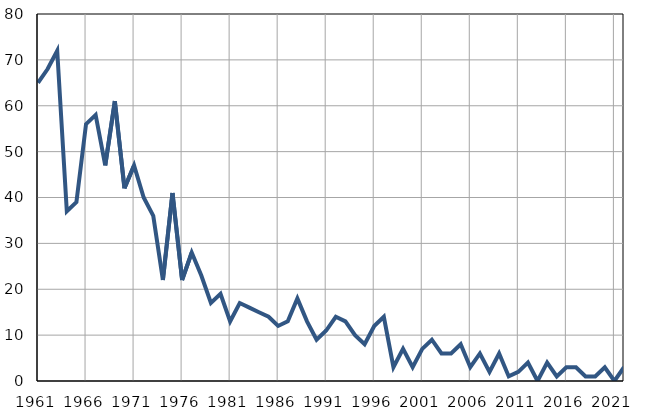
| Category | Infants
deaths |
|---|---|
| 1961.0 | 65 |
| 1962.0 | 68 |
| 1963.0 | 72 |
| 1964.0 | 37 |
| 1965.0 | 39 |
| 1966.0 | 56 |
| 1967.0 | 58 |
| 1968.0 | 47 |
| 1969.0 | 61 |
| 1970.0 | 42 |
| 1971.0 | 47 |
| 1972.0 | 40 |
| 1973.0 | 36 |
| 1974.0 | 22 |
| 1975.0 | 41 |
| 1976.0 | 22 |
| 1977.0 | 28 |
| 1978.0 | 23 |
| 1979.0 | 17 |
| 1980.0 | 19 |
| 1981.0 | 13 |
| 1982.0 | 17 |
| 1983.0 | 16 |
| 1984.0 | 15 |
| 1985.0 | 14 |
| 1986.0 | 12 |
| 1987.0 | 13 |
| 1988.0 | 18 |
| 1989.0 | 13 |
| 1990.0 | 9 |
| 1991.0 | 11 |
| 1992.0 | 14 |
| 1993.0 | 13 |
| 1994.0 | 10 |
| 1995.0 | 8 |
| 1996.0 | 12 |
| 1997.0 | 14 |
| 1998.0 | 3 |
| 1999.0 | 7 |
| 2000.0 | 3 |
| 2001.0 | 7 |
| 2002.0 | 9 |
| 2003.0 | 6 |
| 2004.0 | 6 |
| 2005.0 | 8 |
| 2006.0 | 3 |
| 2007.0 | 6 |
| 2008.0 | 2 |
| 2009.0 | 6 |
| 2010.0 | 1 |
| 2011.0 | 2 |
| 2012.0 | 4 |
| 2013.0 | 0 |
| 2014.0 | 4 |
| 2015.0 | 1 |
| 2016.0 | 3 |
| 2017.0 | 3 |
| 2018.0 | 1 |
| 2019.0 | 1 |
| 2020.0 | 3 |
| 2021.0 | 0 |
| 2022.0 | 3 |